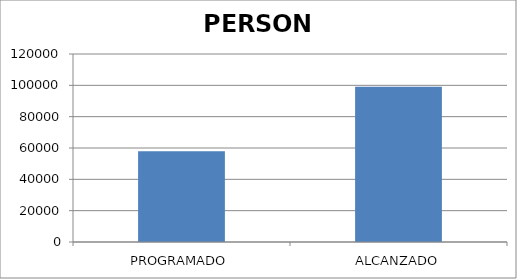
| Category | PERSONA |
|---|---|
| PROGRAMADO | 58000 |
| ALCANZADO | 99020 |